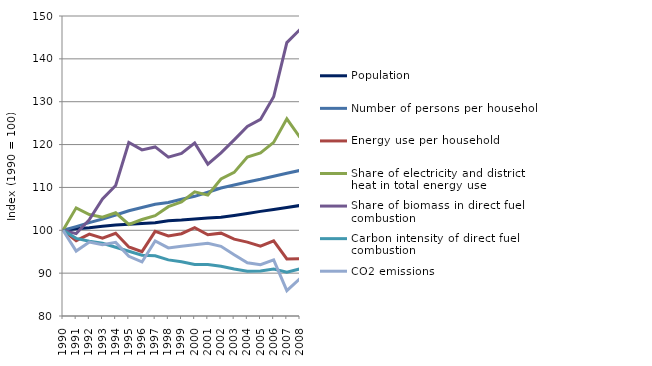
| Category | Population | Number of persons per household | Energy use per household | Share of electricity and district heat in total energy use | Share of biomass in direct fuel combustion | Carbon intensity of direct fuel combustion | CO2 emissions |
|---|---|---|---|---|---|---|---|
| 1990.0 | 100 | 100 | 100 | 100 | 100 | 100 | 100 |
| 1991.0 | 100.336 | 100.867 | 97.573 | 105.232 | 99.228 | 98.12 | 95.141 |
| 1992.0 | 100.607 | 101.793 | 99.098 | 103.68 | 102.476 | 97.423 | 97.241 |
| 1993.0 | 100.954 | 102.638 | 98.154 | 103.059 | 107.295 | 96.966 | 96.615 |
| 1994.0 | 101.207 | 103.572 | 99.311 | 104.081 | 110.446 | 96.036 | 97.178 |
| 1995.0 | 101.408 | 104.556 | 96.118 | 101.358 | 120.484 | 95.096 | 93.92 |
| 1996.0 | 101.588 | 105.303 | 95.019 | 102.506 | 118.764 | 94.202 | 92.613 |
| 1997.0 | 101.752 | 106.063 | 99.757 | 103.396 | 119.449 | 94.054 | 97.529 |
| 1998.0 | 102.239 | 106.484 | 98.686 | 105.511 | 117.069 | 93.097 | 95.884 |
| 1999.0 | 102.387 | 107.254 | 99.196 | 106.605 | 117.949 | 92.676 | 96.275 |
| 2000.0 | 102.632 | 107.921 | 100.624 | 108.967 | 120.364 | 92 | 96.617 |
| 2001.0 | 102.851 | 108.872 | 98.949 | 108.191 | 115.437 | 91.995 | 96.946 |
| 2002.0 | 103.029 | 109.862 | 99.33 | 111.964 | 118.059 | 91.623 | 96.261 |
| 2003.0 | 103.457 | 110.582 | 97.926 | 113.518 | 121.109 | 90.965 | 94.291 |
| 2004.0 | 103.914 | 111.264 | 97.249 | 117.11 | 124.219 | 90.453 | 92.429 |
| 2005.0 | 104.415 | 111.894 | 96.283 | 118.066 | 125.873 | 90.49 | 91.966 |
| 2006.0 | 104.855 | 112.614 | 97.544 | 120.516 | 131.151 | 90.964 | 93.104 |
| 2007.0 | 105.297 | 113.326 | 93.322 | 126.021 | 143.793 | 90.242 | 85.903 |
| 2008.0 | 105.795 | 113.972 | 93.387 | 121.671 | 146.851 | 90.986 | 88.741 |